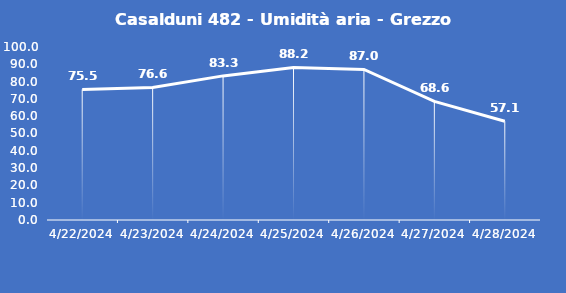
| Category | Casalduni 482 - Umidità aria - Grezzo (%) |
|---|---|
| 4/22/24 | 75.5 |
| 4/23/24 | 76.6 |
| 4/24/24 | 83.3 |
| 4/25/24 | 88.2 |
| 4/26/24 | 87 |
| 4/27/24 | 68.6 |
| 4/28/24 | 57.1 |